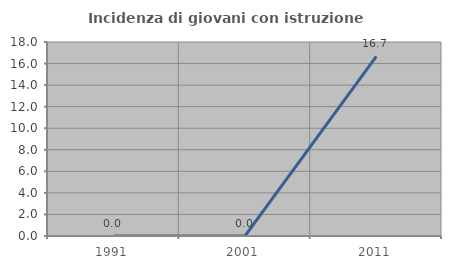
| Category | Incidenza di giovani con istruzione universitaria |
|---|---|
| 1991.0 | 0 |
| 2001.0 | 0 |
| 2011.0 | 16.667 |